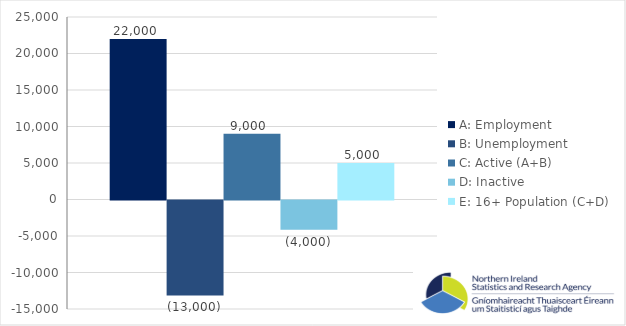
| Category | A: Employment | B: Unemployment | C: Active (A+B) | D: Inactive | E: 16+ Population (C+D) |
|---|---|---|---|---|---|
| 0 | 22000 | -13000 | 9000 | -4000 | 5000 |